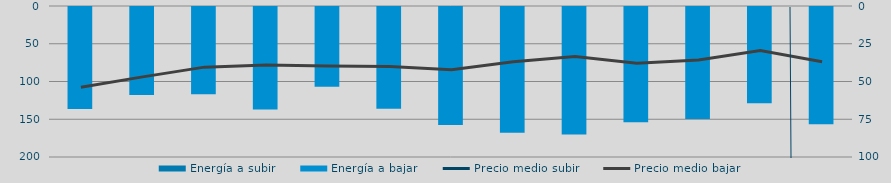
| Category | Energía a subir | Energía a bajar |
|---|---|---|
| D |  | 136.519 |
| E |  | 117.85 |
| F |  | 116.821 |
| M |  | 136.934 |
| A |  | 106.844 |
| M |  | 136.078 |
| J |  | 157.467 |
| J |  | 167.866 |
| A |  | 170.333 |
| S |  | 153.818 |
| O |  | 149.517 |
| N |  | 128.775 |
| D |  | 156.615 |